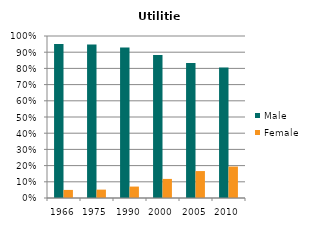
| Category | Male | Female |
|---|---|---|
| 1966.0 | 0.95 | 0.05 |
| 1975.0 | 0.948 | 0.052 |
| 1990.0 | 0.929 | 0.071 |
| 2000.0 | 0.882 | 0.118 |
| 2005.0 | 0.834 | 0.166 |
| 2010.0 | 0.806 | 0.194 |